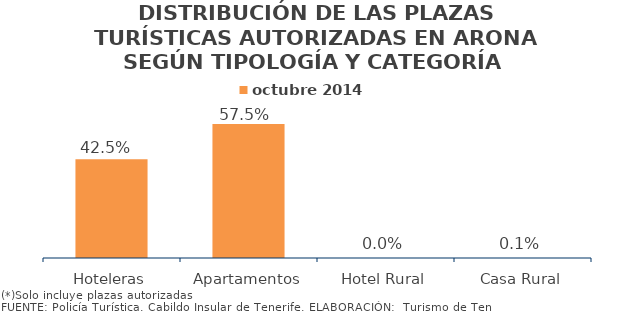
| Category | octubre 2014 |
|---|---|
| Hoteleras | 0.425 |
| Apartamentos | 0.575 |
| Hotel Rural | 0 |
| Casa Rural | 0.001 |